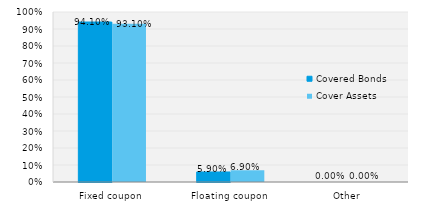
| Category | Covered Bonds | Cover Assets |
|---|---|---|
| Fixed coupon | 0.941 | 0.931 |
| Floating coupon | 0.059 | 0.069 |
| Other | 0 | 0 |